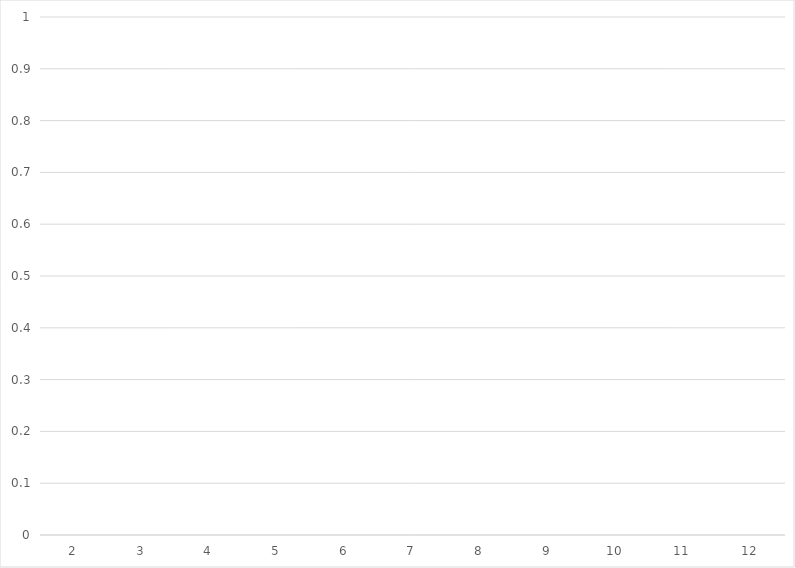
| Category | die 1 = |
|---|---|
| 2.0 | 0 |
| 3.0 | 0 |
| 4.0 | 0 |
| 5.0 | 0 |
| 6.0 | 0 |
| 7.0 | 0 |
| 8.0 | 0 |
| 9.0 | 0 |
| 10.0 | 0 |
| 11.0 | 0 |
| 12.0 | 0 |